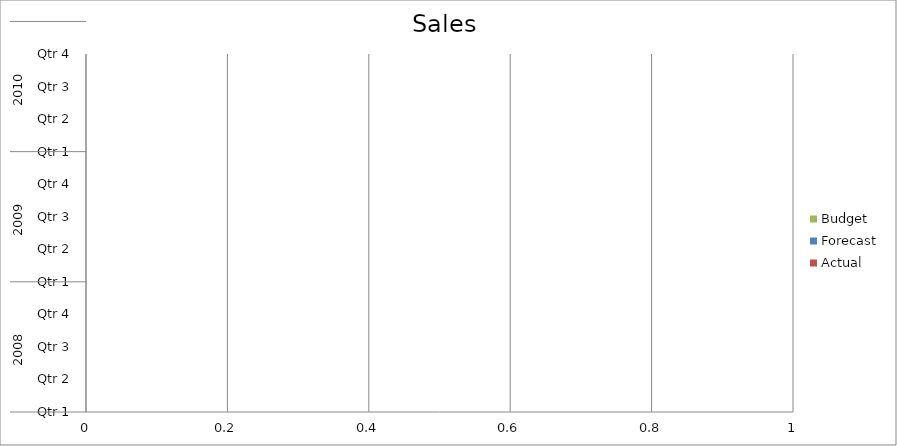
| Category | Budget | Forecast | Actual |
|---|---|---|---|
| 0 | 2810 | 1700 | 1550 |
| 1 | 1900 | 1220 | 3190 |
| 2 | 720 | 830 | 3290 |
| 3 | 3310 | 900 | 3430 |
| 4 | 1560 | 2960 | 2150 |
| 5 | 1040 | 2230 | 760 |
| 6 | 540 | 3110 | 1090 |
| 7 | 1510 | 1020 | 1000 |
| 8 | 790 | 3400 | 1640 |
| 9 | 750 | 2950 | 2310 |
| 10 | 3110 | 2030 | 3170 |
| 11 | 1780 | 1510 | 1120 |